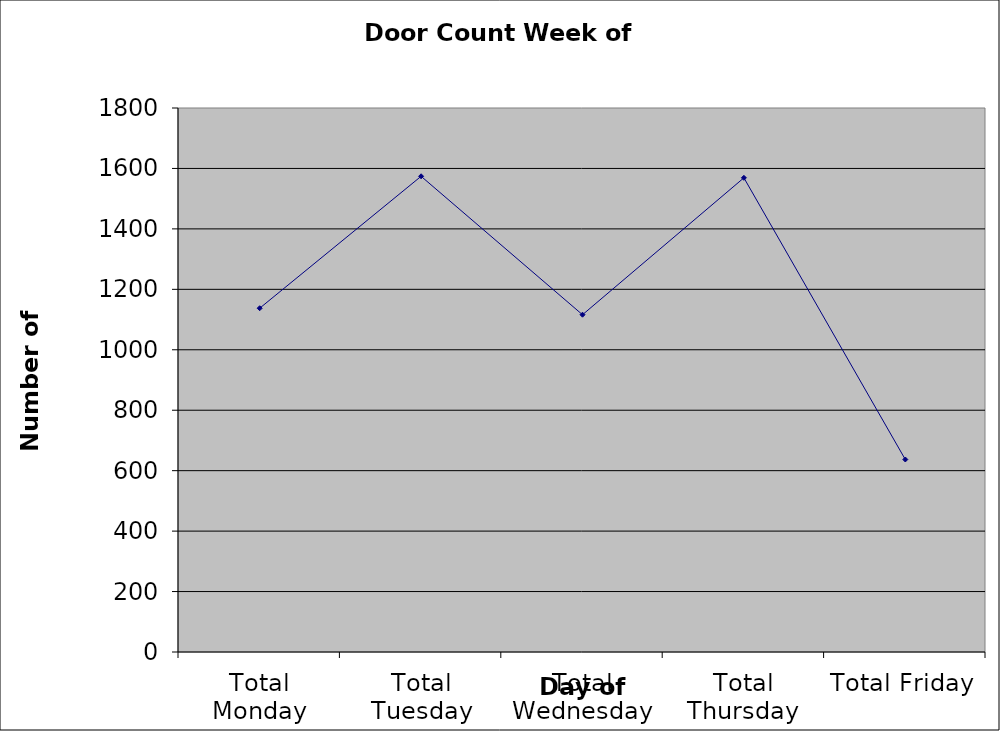
| Category | Series 0 |
|---|---|
| Total Monday | 1137.5 |
| Total Tuesday | 1574 |
| Total Wednesday | 1116 |
| Total Thursday | 1569 |
| Total Friday | 637 |